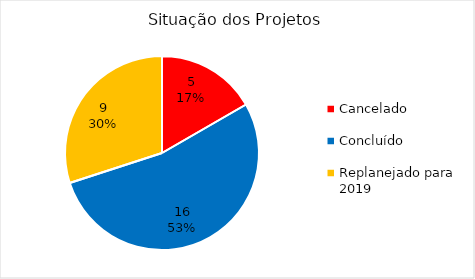
| Category | Total |
|---|---|
| Cancelado | 5 |
| Concluído | 16 |
| Replanejado para 2019 | 9 |